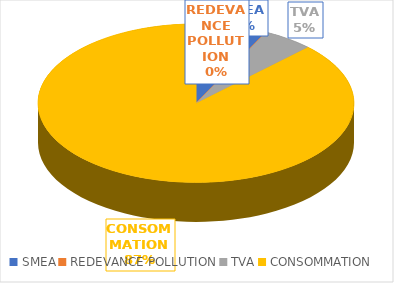
| Category | Series 0 |
|---|---|
| SMEA | 0.15 |
| REDEVANCE POLLUTION | 0 |
| TVA | 0.107 |
| CONSOMMATION | 1.8 |